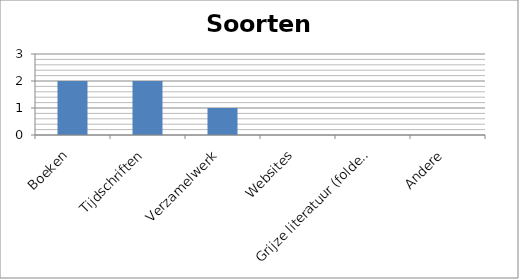
| Category | Soorten bronnen |
|---|---|
| Boeken | 2 |
| Tijdschriften | 2 |
| Verzamelwerk | 1 |
| Websites | 0 |
| Grijze literatuur (folders, rapporten, …) | 0 |
| Andere | 0 |